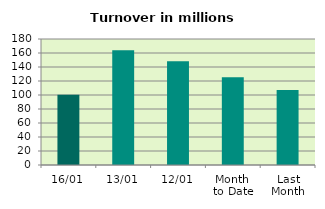
| Category | Series 0 |
|---|---|
| 16/01 | 100.472 |
| 13/01 | 163.973 |
| 12/01 | 148.292 |
| Month 
to Date | 125.237 |
| Last
Month | 107.094 |